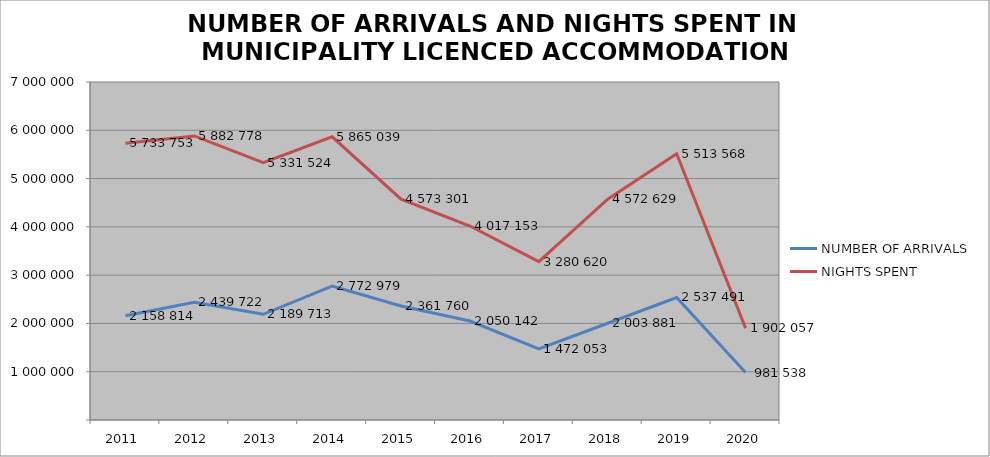
| Category | NUMBER OF ARRIVALS | NIGHTS SPENT |
|---|---|---|
| 2011 | 2158814 | 5733753 |
| 2012 | 2439722 | 5882778 |
| 2013 | 2189713 | 5331524 |
| 2014 | 2772979 | 5865039 |
| 2015 | 2361760 | 4573301 |
| 2016 | 2050142 | 4017153 |
| 2017 | 1472053 | 3280620 |
| 2018 | 2003881 | 4572629 |
| 2019 | 2537491 | 5513568 |
| 2020 | 981538 | 1902057 |